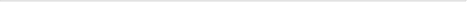
| Category | Series 0 |
|---|---|
| 375.0 | 770 |
| 371.0 | 790 |
| 369.0 | 802 |
| 369.0 | 784 |